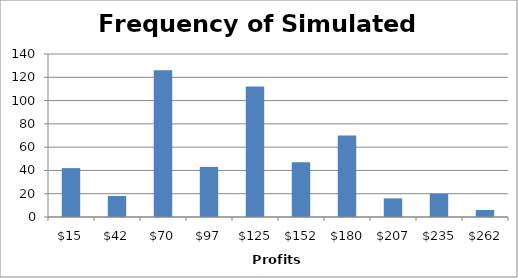
| Category | Series 0 |
|---|---|
| 14.95928796438289 | 42 |
| 42.418575928765776 | 18 |
| 69.87786389314866 | 126 |
| 97.33715185753155 | 43 |
| 124.79643982191445 | 112 |
| 152.2557277862973 | 47 |
| 179.7150157506802 | 70 |
| 207.17430371506308 | 16 |
| 234.63359167944597 | 20 |
| 262.0928796438289 | 6 |